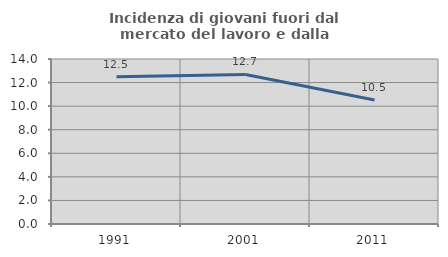
| Category | Incidenza di giovani fuori dal mercato del lavoro e dalla formazione  |
|---|---|
| 1991.0 | 12.5 |
| 2001.0 | 12.69 |
| 2011.0 | 10.526 |